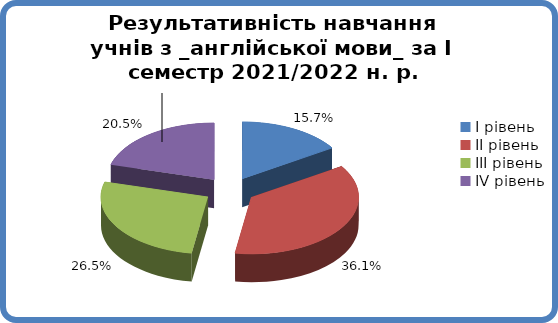
| Category | Series 0 |
|---|---|
| 0 | 0.157 |
| 1 | 0.361 |
| 2 | 0.265 |
| 3 | 0.205 |